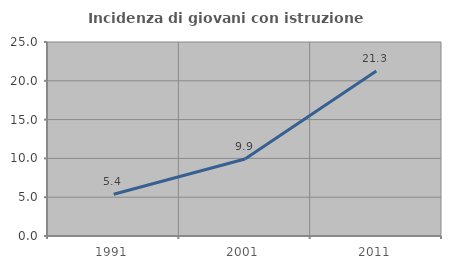
| Category | Incidenza di giovani con istruzione universitaria |
|---|---|
| 1991.0 | 5.375 |
| 2001.0 | 9.914 |
| 2011.0 | 21.266 |